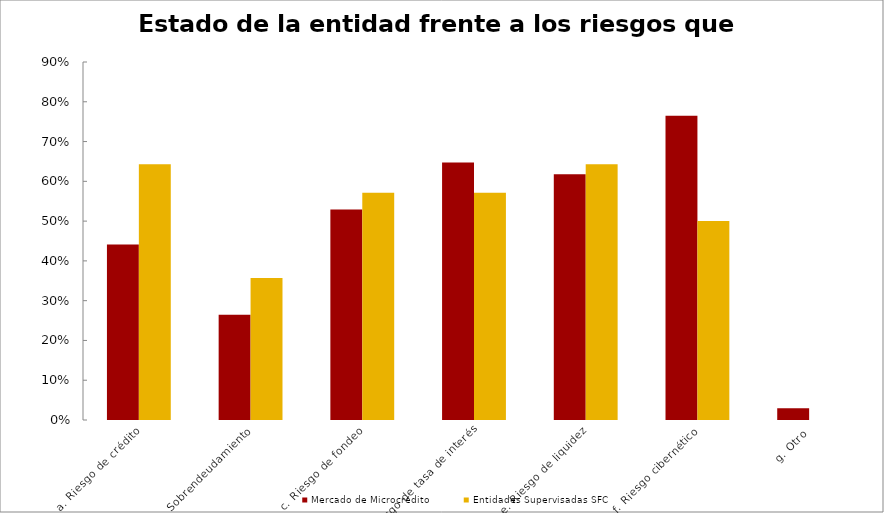
| Category | Mercado de Microcrédito | Entidades Supervisadas SFC |
|---|---|---|
| a. Riesgo de crédito | 0.441 | 0.643 |
| b. Sobrendeudamiento | 0.265 | 0.357 |
| c. Riesgo de fondeo | 0.529 | 0.571 |
| d. Riesgo de tasa de interés | 0.647 | 0.571 |
| e. Riesgo de liquidez | 0.618 | 0.643 |
| f. Riesgo cibernético | 0.765 | 0.5 |
| g. Otro | 0.029 | 0 |